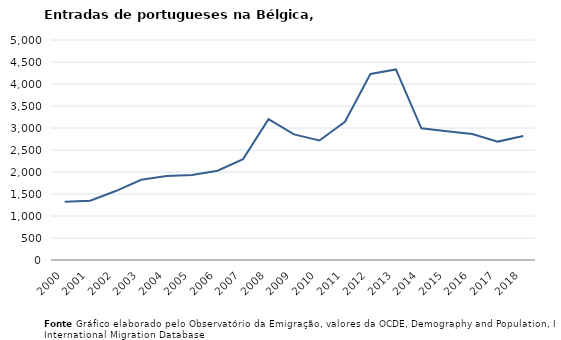
| Category | Entradas |
|---|---|
| 2000.0 | 1324 |
| 2001.0 | 1347 |
| 2002.0 | 1567 |
| 2003.0 | 1823 |
| 2004.0 | 1907 |
| 2005.0 | 1934 |
| 2006.0 | 2030 |
| 2007.0 | 2293 |
| 2008.0 | 3200 |
| 2009.0 | 2854 |
| 2010.0 | 2717 |
| 2011.0 | 3140 |
| 2012.0 | 4228 |
| 2013.0 | 4332 |
| 2014.0 | 2993 |
| 2015.0 | 2927 |
| 2016.0 | 2863 |
| 2017.0 | 2691 |
| 2018.0 | 2816 |